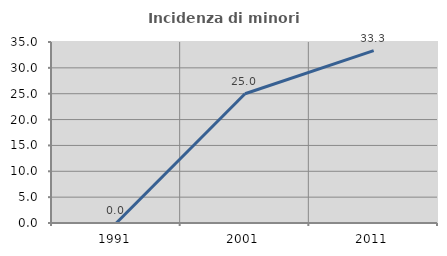
| Category | Incidenza di minori stranieri |
|---|---|
| 1991.0 | 0 |
| 2001.0 | 25 |
| 2011.0 | 33.333 |